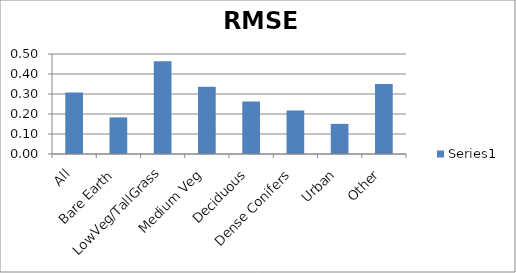
| Category | Series 0 |
|---|---|
| All | 0.308 |
| Bare Earth | 0.183 |
| LowVeg/TallGrass | 0.464 |
| Medium Veg | 0.336 |
| Deciduous | 0.262 |
| Dense Conifers | 0.218 |
| Urban | 0.151 |
| Other | 0.35 |